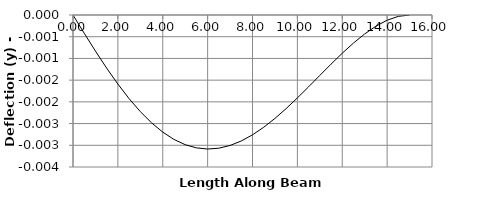
| Category | y |
|---|---|
| 0.0 | 0 |
| 0.0 | 0 |
| 0.5 | 0 |
| 1.0 | -0.001 |
| 1.5 | -0.001 |
| 1.99999 | -0.002 |
| 2.0 | -0.002 |
| 2.00001 | -0.002 |
| 2.5 | -0.002 |
| 3.0 | -0.002 |
| 3.5 | -0.002 |
| 4.0 | -0.003 |
| 4.5 | -0.003 |
| 5.0 | -0.003 |
| 5.5 | -0.003 |
| 6.0 | -0.003 |
| 6.5 | -0.003 |
| 7.0 | -0.003 |
| 7.5 | -0.003 |
| 8.0 | -0.003 |
| 8.5 | -0.003 |
| 9.0 | -0.002 |
| 9.5 | -0.002 |
| 10.0 | -0.002 |
| 10.5 | -0.002 |
| 11.0 | -0.001 |
| 11.5 | -0.001 |
| 12.0 | -0.001 |
| 12.5 | -0.001 |
| 13.0 | 0 |
| 13.5 | 0 |
| 14.0 | 0 |
| 14.5 | 0 |
| 15.0 | 0 |